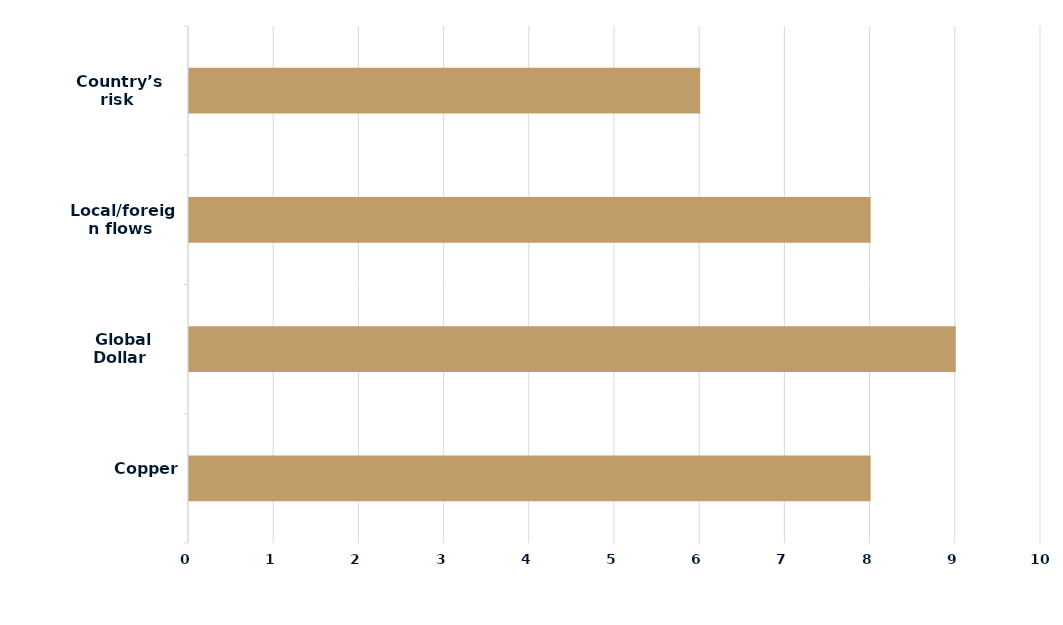
| Category | Series 0 |
|---|---|
|  Copper | 8 |
|  Global Dollar | 9 |
|  Local/foreign flows | 8 |
|  Country’s risk | 6 |